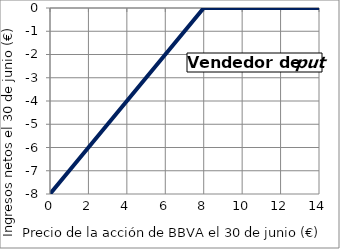
| Category | Comprador |
|---|---|
| 0.0 | -8 |
| 1.0 | -7 |
| 2.0 | -6 |
| 3.0 | -5 |
| 4.0 | -4 |
| 5.0 | -3 |
| 6.0 | -2 |
| 7.0 | -1 |
| 8.0 | 0 |
| 9.0 | 0 |
| 10.0 | 0 |
| 11.0 | 0 |
| 12.0 | 0 |
| 13.0 | 0 |
| 14.0 | 0 |